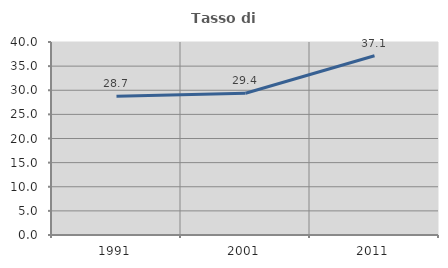
| Category | Tasso di occupazione   |
|---|---|
| 1991.0 | 28.739 |
| 2001.0 | 29.39 |
| 2011.0 | 37.143 |